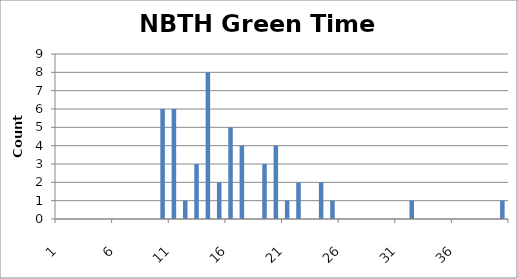
| Category | Series 0 |
|---|---|
| 0 | 0 |
| 1 | 0 |
| 2 | 0 |
| 3 | 0 |
| 4 | 0 |
| 5 | 0 |
| 6 | 0 |
| 7 | 0 |
| 8 | 0 |
| 9 | 6 |
| 10 | 6 |
| 11 | 1 |
| 12 | 3 |
| 13 | 8 |
| 14 | 2 |
| 15 | 5 |
| 16 | 4 |
| 17 | 0 |
| 18 | 3 |
| 19 | 4 |
| 20 | 1 |
| 21 | 2 |
| 22 | 0 |
| 23 | 2 |
| 24 | 1 |
| 25 | 0 |
| 26 | 0 |
| 27 | 0 |
| 28 | 0 |
| 29 | 0 |
| 30 | 0 |
| 31 | 1 |
| 32 | 0 |
| 33 | 0 |
| 34 | 0 |
| 35 | 0 |
| 36 | 0 |
| 37 | 0 |
| 38 | 0 |
| 39 | 1 |